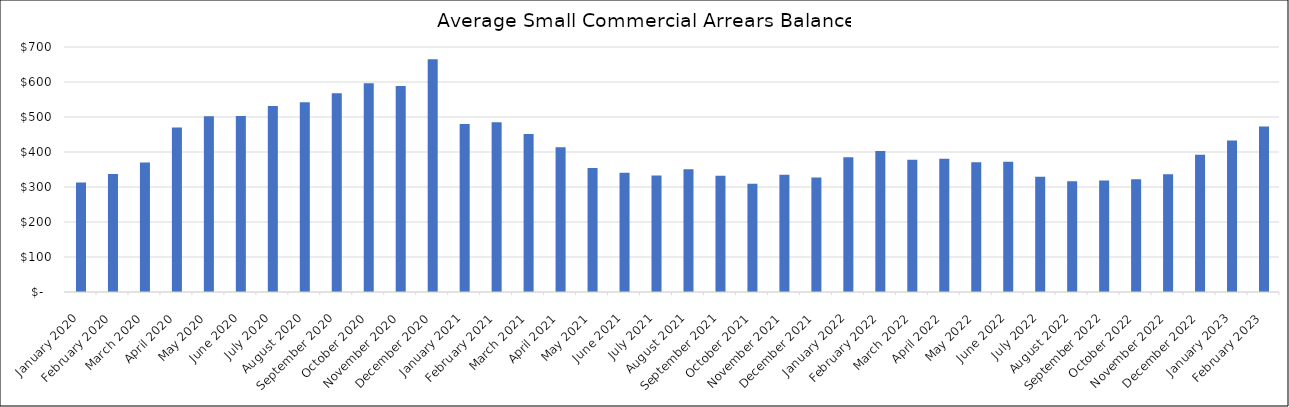
| Category | Average Arrears Balance |
|---|---|
| 2020-01-01 | 312.571 |
| 2020-02-01 | 337.174 |
| 2020-03-01 | 370.327 |
| 2020-04-01 | 469.676 |
| 2020-05-01 | 502.258 |
| 2020-06-01 | 502.878 |
| 2020-07-01 | 531.174 |
| 2020-08-01 | 542.174 |
| 2020-09-01 | 567.811 |
| 2020-10-01 | 596.696 |
| 2020-11-01 | 588.853 |
| 2020-12-01 | 664.794 |
| 2021-01-01 | 480.172 |
| 2021-02-01 | 485.086 |
| 2021-03-01 | 451.474 |
| 2021-04-01 | 413.382 |
| 2021-05-01 | 354.483 |
| 2021-06-01 | 340.643 |
| 2021-07-01 | 333.024 |
| 2021-08-01 | 350.681 |
| 2021-09-01 | 332.401 |
| 2021-10-01 | 309.069 |
| 2021-11-01 | 334.658 |
| 2021-12-01 | 326.904 |
| 2022-01-01 | 385.272 |
| 2022-02-01 | 402.611 |
| 2022-03-01 | 377.534 |
| 2022-04-01 | 380.841 |
| 2022-05-01 | 370.689 |
| 2022-06-01 | 371.844 |
| 2022-07-01 | 329.126 |
| 2022-08-01 | 316.403 |
| 2022-09-01 | 318.637 |
| 2022-10-01 | 322.027 |
| 2022-11-01 | 336.587 |
| 2022-12-02 | 392.139 |
| 2023-01-01 | 433.172 |
| 2023-02-01 | 472.909 |